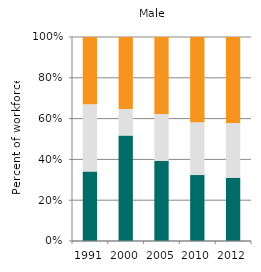
| Category | Agriculture | Industry | Services |
|---|---|---|---|
| 1991.0 | 34.081 | 32.983 | 32.937 |
| 2000.0 | 51.697 | 12.994 | 35.309 |
| 2005.0 | 39.296 | 22.987 | 37.716 |
| 2010.0 | 32.32 | 25.917 | 41.762 |
| 2012.0 | 31.044 | 26.804 | 42.152 |